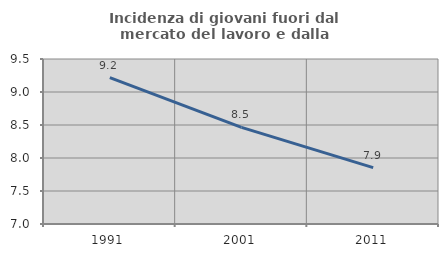
| Category | Incidenza di giovani fuori dal mercato del lavoro e dalla formazione  |
|---|---|
| 1991.0 | 9.219 |
| 2001.0 | 8.464 |
| 2011.0 | 7.854 |